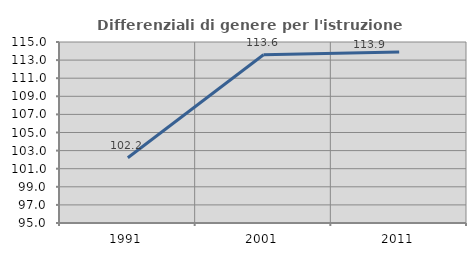
| Category | Differenziali di genere per l'istruzione superiore |
|---|---|
| 1991.0 | 102.212 |
| 2001.0 | 113.593 |
| 2011.0 | 113.905 |